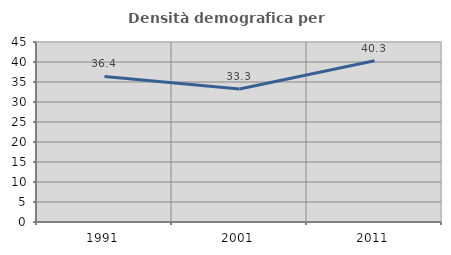
| Category | Densità demografica |
|---|---|
| 1991.0 | 36.399 |
| 2001.0 | 33.251 |
| 2011.0 | 40.334 |